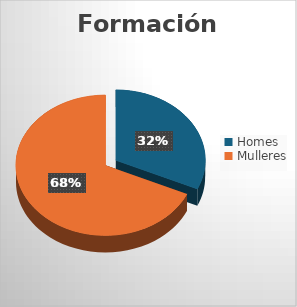
| Category | Formación recoñecida |
|---|---|
| Homes | 13 |
| Mulleres | 28 |